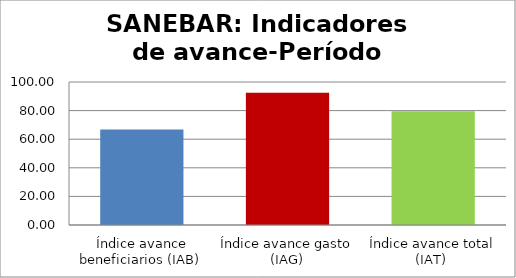
| Category | Series 0 |
|---|---|
| Índice avance beneficiarios (IAB)  | 66.707 |
| Índice avance gasto (IAG) | 92.545 |
| Índice avance total (IAT)  | 79.626 |